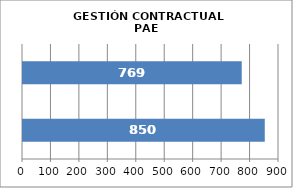
| Category | GESTIÓN CONTRACTUAL PAE |
|---|---|
| # Contratos Programados | 850 |
| # Contratos Suscritos | 769 |